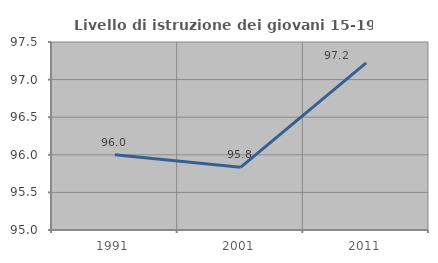
| Category | Livello di istruzione dei giovani 15-19 anni |
|---|---|
| 1991.0 | 96 |
| 2001.0 | 95.833 |
| 2011.0 | 97.222 |